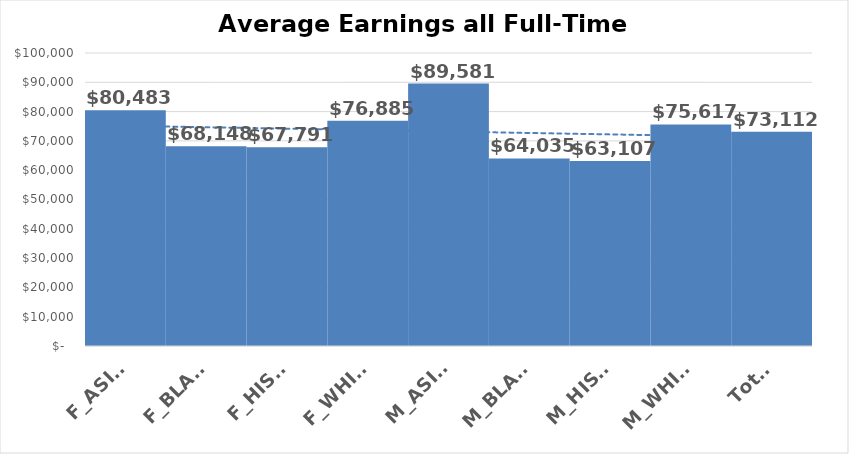
| Category | Mean |
|---|---|
| F_ASIAN | 80483.098 |
| F_BLACK | 68148.23 |
| F_HISPA | 67791.459 |
| F_WHITE | 76884.517 |
| M_ASIAN | 89580.532 |
| M_BLACK | 64035.039 |
| M_HISPA | 63107.044 |
| M_WHITE | 75616.993 |
| Total | 73112.301 |